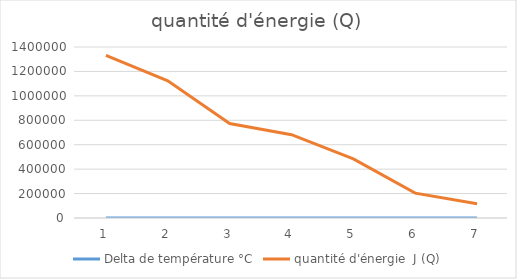
| Category | Delta de température °C | quantité d'énergie  J (Q) |
|---|---|---|
| 0 | 566.39 | 1331016.5 |
| 1 | 477.7 | 1122595 |
| 2 | 329.15 | 773502.5 |
| 3 | 290.23 | 682040.5 |
| 4 | 205.82 | 483677 |
| 5 | 86.47 | 203204.5 |
| 6 | 49.37 | 116019.5 |